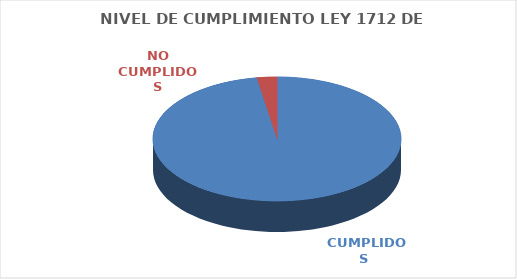
| Category | Series 0 |
|---|---|
|  CUMPLIDOS | 112 |
| NO CUMPLIDOS | 3 |